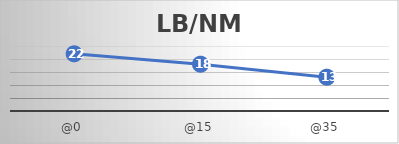
| Category | LB/NM |
|---|---|
| @0 | 22 |
| @15 | 18 |
| @35 | 13 |